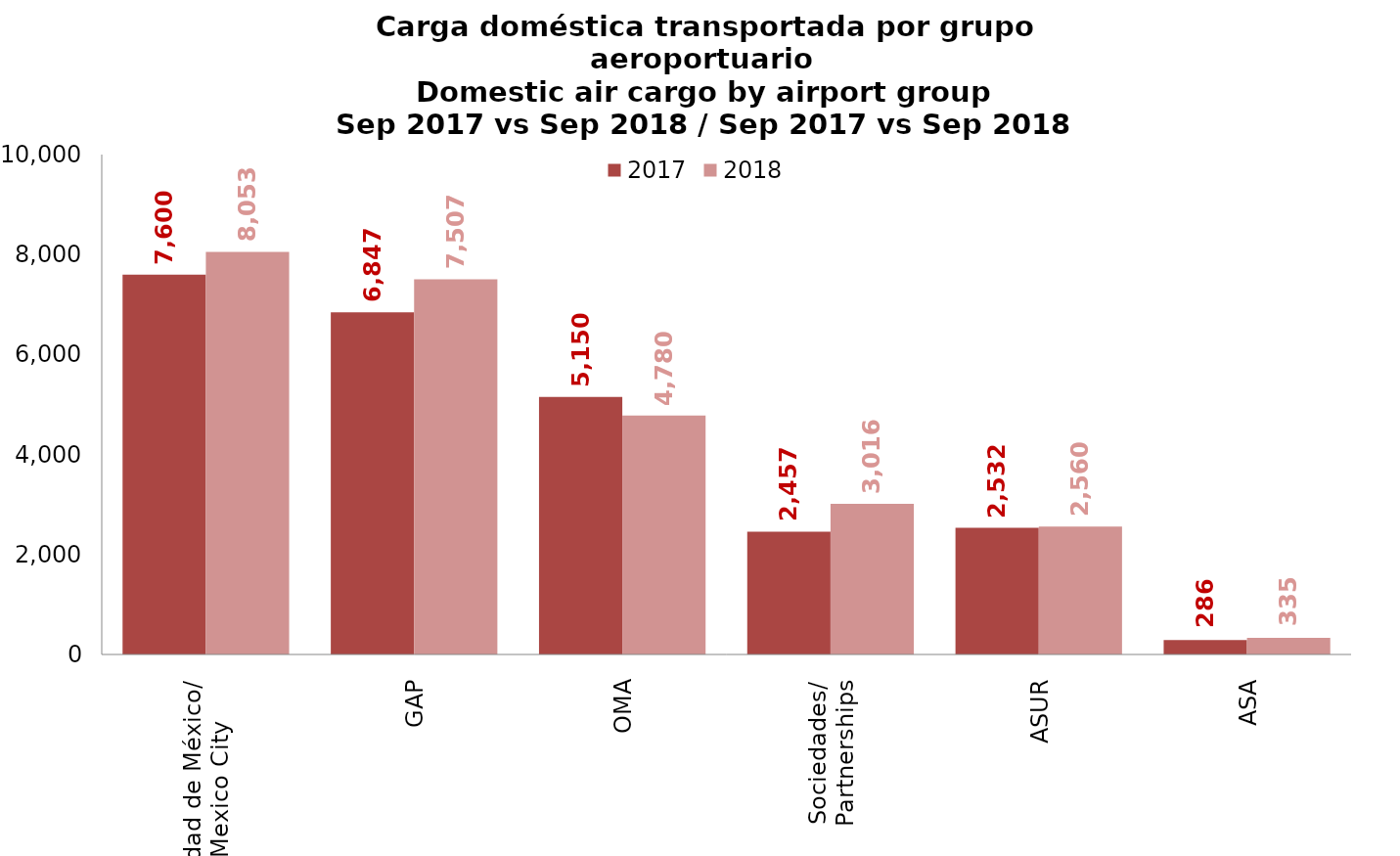
| Category | 2017 | 2018 |
|---|---|---|
| Ciudad de México/
Mexico City | 7600.13 | 8052.93 |
| GAP | 6846.536 | 7506.569 |
| OMA | 5149.789 | 4779.53 |
| Sociedades/
Partnerships | 2456.622 | 3015.556 |
| ASUR | 2532.193 | 2560.113 |
| ASA | 286.299 | 334.954 |